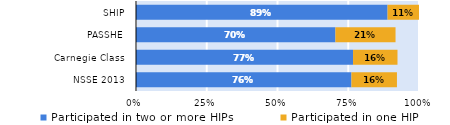
| Category | Participated in two or more HIPs | Participated in one HIP |
|---|---|---|
| NSSE 2013 | 0.761 | 0.161 |
| Carnegie Class | 0.767 | 0.157 |
| PASSHE | 0.705 | 0.212 |
| SHIP | 0.889 | 0.111 |